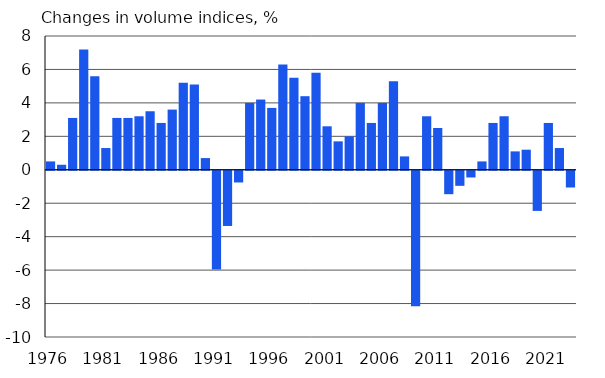
| Category | Changes in volume indices, % |
|---|---|
| 1976 | 0.5 |
| 1977 | 0.3 |
| 1978 | 3.1 |
| 1979 | 7.2 |
| 1980 | 5.6 |
| 1981 | 1.3 |
| 1982 | 3.1 |
| 1983 | 3.1 |
| 1984 | 3.2 |
| 1985 | 3.5 |
| 1986 | 2.8 |
| 1987 | 3.6 |
| 1988 | 5.2 |
| 1989 | 5.1 |
| 1990 | 0.7 |
| 1991 | -5.9 |
| 1992 | -3.3 |
| 1993 | -0.7 |
| 1994 | 4 |
| 1995 | 4.2 |
| 1996 | 3.7 |
| 1997 | 6.3 |
| 1998 | 5.5 |
| 1999 | 4.4 |
| 2000 | 5.8 |
| 2001 | 2.6 |
| 2002 | 1.7 |
| 2003 | 2 |
| 2004 | 4 |
| 2005 | 2.8 |
| 2006 | 4 |
| 2007 | 5.3 |
| 2008 | 0.8 |
| 2009 | -8.1 |
| 2010 | 3.2 |
| 2011 | 2.5 |
| 2012 | -1.4 |
| 2013 | -0.9 |
| 2014 | -0.4 |
| 2015 | 0.5 |
| 2016 | 2.8 |
| 2017 | 3.2 |
| 2018 | 1.1 |
| 2019 | 1.2 |
| 2020 | -2.4 |
| 2021 | 2.8 |
| 2022* | 1.3 |
| 2023* | -1 |